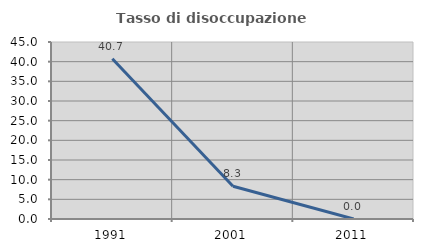
| Category | Tasso di disoccupazione giovanile  |
|---|---|
| 1991.0 | 40.741 |
| 2001.0 | 8.333 |
| 2011.0 | 0 |